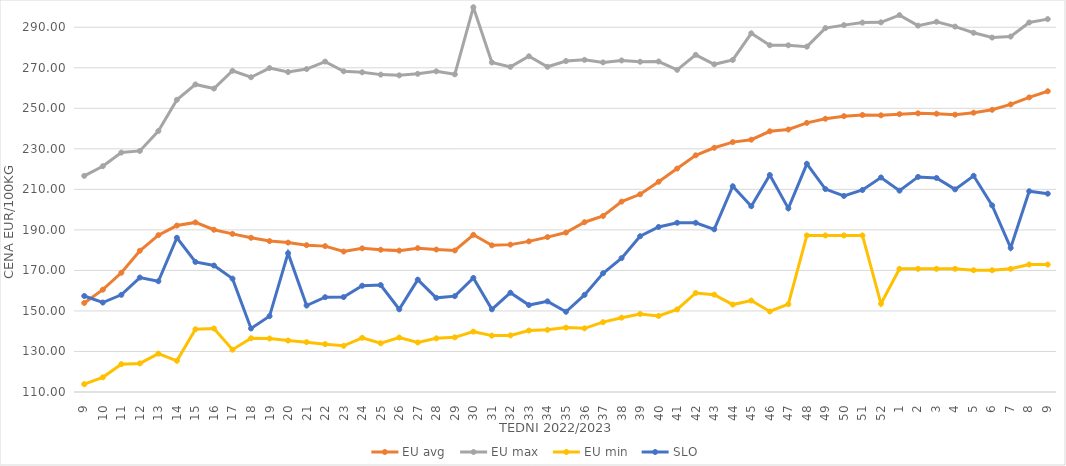
| Category | EU avg | EU max | EU min | SLO |
|---|---|---|---|---|
| 9.0 | 153.947 | 216.67 | 113.871 | 157.38 |
| 10.0 | 160.496 | 221.43 | 117.233 | 154.16 |
| 11.0 | 168.845 | 228.17 | 123.737 | 157.96 |
| 12.0 | 179.714 | 228.97 | 124.105 | 166.49 |
| 13.0 | 187.409 | 238.81 | 128.918 | 164.66 |
| 14.0 | 192.137 | 254.21 | 125.399 | 186.11 |
| 15.0 | 193.697 | 261.79 | 140.954 | 174.18 |
| 16.0 | 190.066 | 259.76 | 141.337 | 172.42 |
| 17.0 | 188.031 | 268.52 | 130.897 | 165.96 |
| 18.0 | 186.119 | 265.34 | 136.529 | 141.36 |
| 19.0 | 184.47 | 269.87 | 136.387 | 147.43 |
| 20.0 | 183.734 | 267.92 | 135.392 | 178.51 |
| 21.0 | 182.45 | 269.38 | 134.589 | 152.67 |
| 22.0 | 181.991 | 273.06 | 133.621 | 156.8 |
| 23.0 | 179.308 | 268.27 | 132.787 | 156.84 |
| 24.0 | 180.886 | 267.77 | 136.75 | 162.44 |
| 25.0 | 180.2 | 266.63 | 134.058 | 162.78 |
| 26.0 | 179.77 | 266.27 | 136.895 | 150.82 |
| 27.0 | 180.992 | 267.02 | 134.44 | 165.45 |
| 28.0 | 180.305 | 268.25 | 136.486 | 156.46 |
| 29.0 | 179.847 | 266.77 | 136.97 | 157.31 |
| 30.0 | 187.576 | 299.87 | 139.777 | 166.29 |
| 31.0 | 182.385 | 272.64 | 137.828 | 150.81 |
| 32.0 | 182.73 | 270.47 | 137.934 | 158.99 |
| 33.0 | 184.343 | 275.68 | 140.33 | 152.91 |
| 34.0 | 186.448 | 270.49 | 140.7 | 154.73 |
| 35.0 | 188.684 | 273.33 | 141.78 | 149.6 |
| 36.0 | 193.792 | 273.91 | 141.41 | 157.93 |
| 37.0 | 196.877 | 272.67 | 144.47 | 168.61 |
| 38.0 | 203.962 | 273.63 | 146.68 | 176.07 |
| 39.0 | 207.574 | 272.98 | 148.499 | 186.86 |
| 40.0 | 213.785 | 273.1 | 147.54 | 191.45 |
| 41.0 | 220.272 | 268.98 | 150.75 | 193.52 |
| 42.0 | 226.803 | 276.39 | 158.87 | 193.52 |
| 43.0 | 230.521 | 271.72 | 158.04 | 190.28 |
| 44.0 | 233.325 | 273.856 | 153.16 | 211.53 |
| 45.0 | 234.517 | 287.021 | 155.13 | 201.69 |
| 46.0 | 238.669 | 281.133 | 149.75 | 217.08 |
| 47.0 | 239.534 | 281.102 | 153.36 | 200.62 |
| 48.0 | 242.81 | 280.434 | 187.26 | 222.61 |
| 49.0 | 244.854 | 289.585 | 187.26 | 210.16 |
| 50.0 | 246.132 | 291.057 | 187.26 | 206.76 |
| 51.0 | 246.705 | 292.307 | 187.26 | 209.69 |
| 52.0 | 246.546 | 292.426 | 153.54 | 215.87 |
| 1.0 | 247.118 | 295.98 | 170.79 | 209.37 |
| 2.0 | 247.516 | 290.8 | 170.79 | 216.15 |
| 3.0 | 247.327 | 292.71 | 170.79 | 215.63 |
| 4.0 | 246.864 | 290.32 | 170.79 | 210 |
| 5.0 | 247.827 | 287.27 | 170.09 | 216.7 |
| 6.0 | 249.274 | 284.92 | 170.09 | 202.1 |
| 7.0 | 251.933 | 285.42 | 170.79 | 181.11 |
| 8.0 | 255.372 | 292.35 | 172.91 | 209.08 |
| 9.0 | 258.412 | 294.02 | 172.91 | 207.87 |